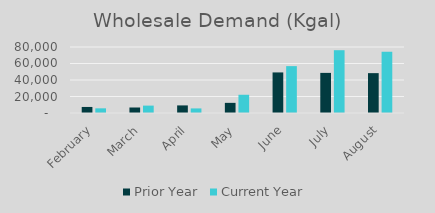
| Category | Prior Year | Current Year |
|---|---|---|
| February | 7328 | 5662 |
| March | 6673 | 8964 |
| April | 9201 | 5557 |
| May | 12299 | 22105 |
| June | 49180 | 56817 |
| July | 48620 | 76109 |
| August | 48323 | 74243 |